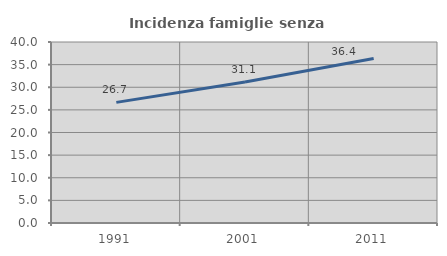
| Category | Incidenza famiglie senza nuclei |
|---|---|
| 1991.0 | 26.654 |
| 2001.0 | 31.14 |
| 2011.0 | 36.375 |